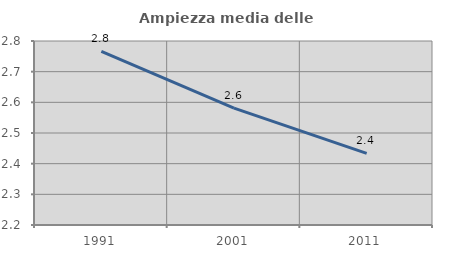
| Category | Ampiezza media delle famiglie |
|---|---|
| 1991.0 | 2.766 |
| 2001.0 | 2.581 |
| 2011.0 | 2.433 |